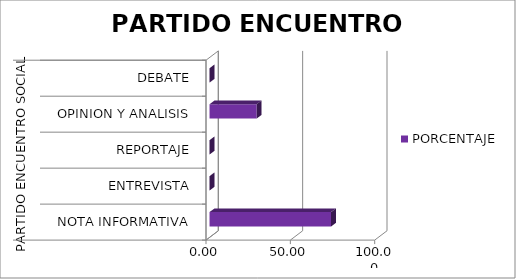
| Category | PORCENTAJE |
|---|---|
| 0 | 72.047 |
| 1 | 0 |
| 2 | 0 |
| 3 | 27.953 |
| 4 | 0 |